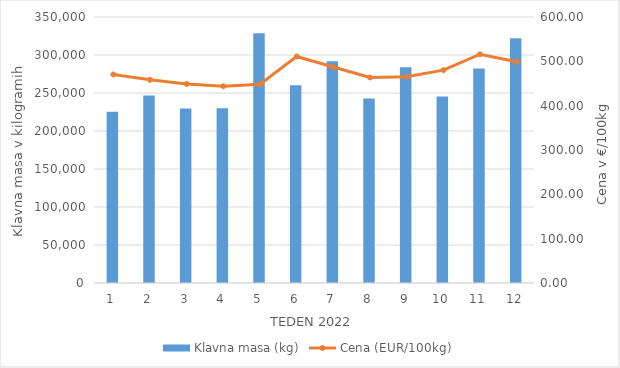
| Category | Klavna masa (kg) |
|---|---|
| 1.0 | 225300 |
| 2.0 | 246712 |
| 3.0 | 229541 |
| 4.0 | 230074 |
| 5.0 | 328640 |
| 6.0 | 260108 |
| 7.0 | 291887 |
| 8.0 | 242732 |
| 9.0 | 283987 |
| 10.0 | 245414 |
| 11.0 | 282092 |
| 12.0 | 321936 |